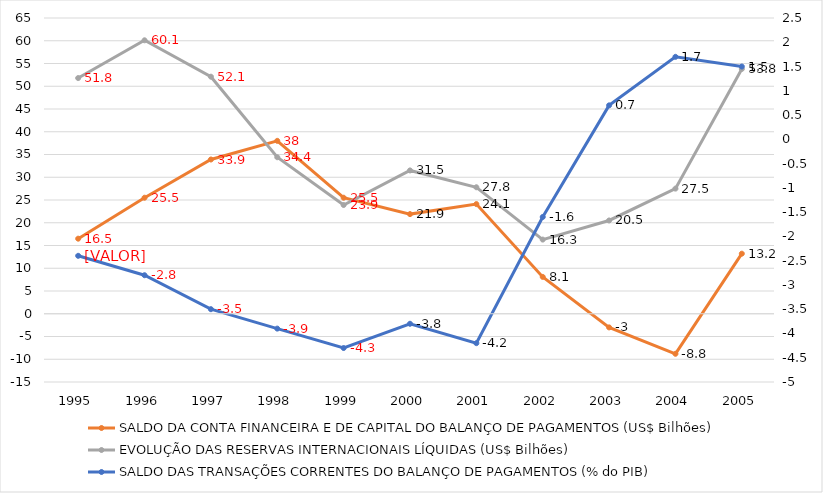
| Category | SALDO DA CONTA FINANCEIRA E DE CAPITAL DO BALANÇO DE PAGAMENTOS (US$ Bilhões) | EVOLUÇÃO DAS RESERVAS INTERNACIONAIS LÍQUIDAS (US$ Bilhões) |
|---|---|---|
| 1995.0 | 16.5 | 51.8 |
| 1996.0 | 25.5 | 60.1 |
| 1997.0 | 33.9 | 52.1 |
| 1998.0 | 38 | 34.4 |
| 1999.0 | 25.5 | 23.9 |
| 2000.0 | 21.9 | 31.5 |
| 2001.0 | 24.1 | 27.8 |
| 2002.0 | 8.1 | 16.3 |
| 2003.0 | -3 | 20.5 |
| 2004.0 | -8.8 | 27.5 |
| 2005.0 | 13.2 | 53.8 |